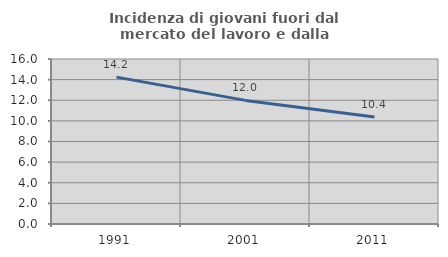
| Category | Incidenza di giovani fuori dal mercato del lavoro e dalla formazione  |
|---|---|
| 1991.0 | 14.241 |
| 2001.0 | 11.986 |
| 2011.0 | 10.366 |